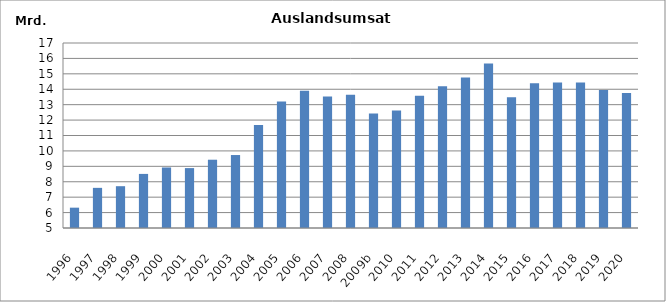
| Category | Series 0 |
|---|---|
| 1996 | 6319142 |
| 1997 | 7603819 |
| 1998 | 7711587 |
| 1999 | 8508603 |
| 2000 | 8925754 |
| 2001 | 8885463 |
| 2002 | 9428713 |
| 2003 | 9733339 |
| 2004 | 11680546 |
| 2005 | 13208153 |
| 2006 | 13901521 |
| 2007 | 13537187 |
| 2008 | 13649884 |
| 2009b | 12432618 |
| 2010 | 12628416.402 |
| 2011 | 13577795 |
| 2012 | 14199097 |
| 2013 | 14765099 |
| 2014 | 15677925.464 |
| 2015 | 13486756 |
| 2016 | 14385658 |
| 2017 | 14436506 |
| 2018 | 14434940 |
| 2019 | 13955245 |
| 2020 | 13761427 |